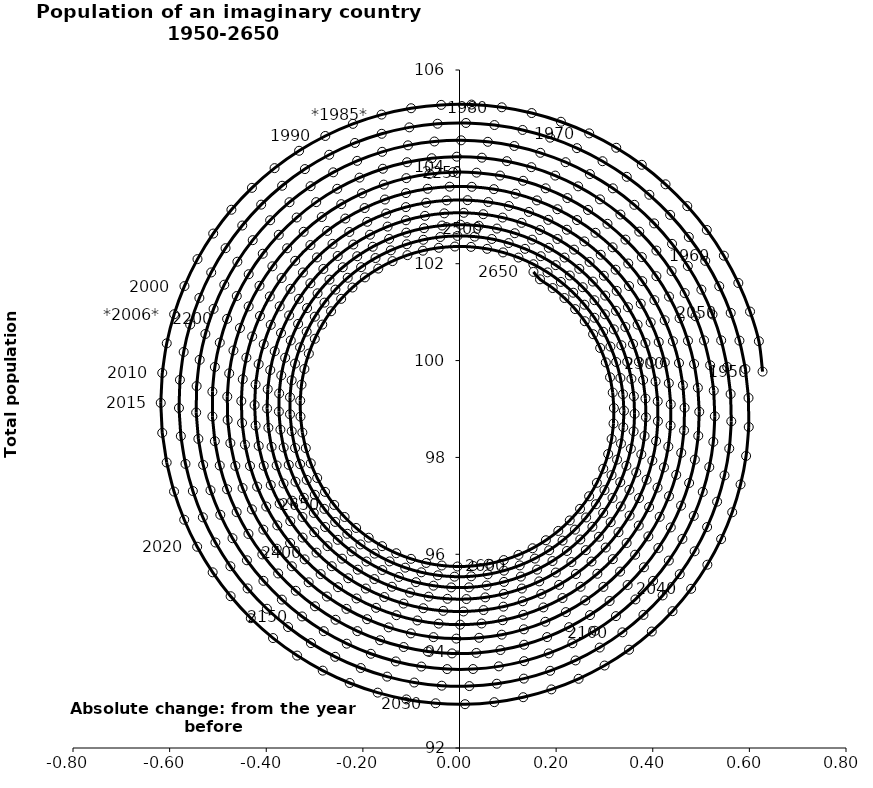
| Category | Series 0 |
|---|---|
| 0.6272672519604754 | 99.772 |
| 0.6196562045831158 | 100.399 |
| 0.6013943906948924 | 101.011 |
| 0.5771655351149434 | 101.602 |
| 0.5472234289554052 | 102.166 |
| 0.511878389816026 | 102.697 |
| 0.4714940510418586 | 103.189 |
| 0.42648362516273153 | 103.64 |
| 0.3773056798647474 | 104.042 |
| 0.3244594696350873 | 104.394 |
| 0.2684798705715252 | 104.691 |
| 0.2099319697122155 | 104.931 |
| 0.1494053635898922 | 105.111 |
| 0.08750822350796739 | 105.23 |
| 0.024861187246976613 | 105.286 |
| -0.03790886147280048 | 105.28 |
| -0.10017506345125327 | 105.21 |
| -0.1613168416955233 | 105.079 |
| -0.22072608389074588 | 104.888 |
| -0.2778131880872081 | 104.638 |
| -0.33201291152538914 | 104.332 |
| -0.38278996460490333 | 103.974 |
| -0.42964429466364606 | 103.567 |
| -0.47211600744074644 | 103.115 |
| -0.5097898778187471 | 102.622 |
| -0.5422994056341395 | 102.095 |
| -0.56933037697938 | 101.538 |
| -0.5906238964330512 | 100.956 |
| -0.605978861002896 | 100.356 |
| -0.6152538522048658 | 99.744 |
| -0.6183684285482727 | 99.126 |
| -0.6153038067254641 | 98.508 |
| -0.6061029259272743 | 97.895 |
| -0.5908698958723164 | 97.295 |
| -0.5697688352941057 | 96.714 |
| -0.5430221136981856 | 96.156 |
| -0.5109080151330829 | 95.628 |
| -0.4737578484511502 | 95.134 |
| -0.4319525340150321 | 94.68 |
| -0.3859187019663963 | 94.27 |
| -0.3361243419849913 | 93.908 |
| -0.28307404886029985 | 93.598 |
| -0.22730391214496848 | 93.342 |
| -0.1693761016173383 | 93.143 |
| -0.1098732032105545 | 93.003 |
| -0.049392362451442295 | 92.924 |
| 0.01146070574339575 | 92.905 |
| 0.07207778084860195 | 92.946 |
| 0.1318542134080971 | 93.049 |
| 0.1901949539233172 | 93.21 |
| 0.2465204738621054 | 93.429 |
| 0.3002725198967795 | 93.703 |
| 0.3509196442617366 | 94.03 |
| 0.3979624564693651 | 94.405 |
| 0.44093854451652703 | 94.826 |
| 0.4794270171128403 | 95.287 |
| 0.5130526223460805 | 95.784 |
| 0.5414894025156158 | 96.313 |
| 0.56446384957367 | 96.867 |
| 0.5817575306752616 | 97.442 |
| 0.593209158683436 | 98.031 |
| 0.5987160880698426 | 98.628 |
| 0.5982352224266663 | 99.228 |
| 0.5917833257051299 | 99.825 |
| 0.5794367352648067 | 100.412 |
| 0.5613304807951423 | 100.984 |
| 0.5376568190890296 | 101.535 |
| 0.5086632004642269 | 102.059 |
| 0.47464968827024734 | 102.552 |
| 0.4359658583291548 | 103.008 |
| 0.3930072103057398 | 103.424 |
| 0.34621112780489227 | 103.794 |
| 0.2960524284253978 | 104.116 |
| 0.24303854901414468 | 104.386 |
| 0.18770441491209766 | 104.602 |
| 0.13060704504295018 | 104.762 |
| 0.07231994722744162 | 104.864 |
| 0.013427360092300944 | 104.906 |
| -0.04548160063804829 | 104.89 |
| -0.10381883284085802 | 104.816 |
| -0.16100311680606438 | 104.683 |
| -0.21646590361674356 | 104.494 |
| -0.26965696547582496 | 104.25 |
| -0.32004985184911305 | 103.954 |
| -0.3671470973470292 | 103.61 |
| -0.4104851298504002 | 103.22 |
| -0.4496388304846519 | 102.789 |
| -0.48422570061708115 | 102.321 |
| -0.5139095950632253 | 101.82 |
| -0.5384039851029385 | 101.293 |
| -0.5574747196720509 | 100.743 |
| -0.5709422581673564 | 100.178 |
| -0.5786833536307228 | 99.602 |
| -0.5806321706106488 | 99.02 |
| -0.5767808276674629 | 98.44 |
| -0.5671793602593951 | 97.867 |
| -0.551935105536522 | 97.306 |
| -0.5312115163388924 | 96.763 |
| -0.5052264173804701 | 96.244 |
| -0.4742497221381896 | 95.753 |
| -0.43860063431895213 | 95.295 |
| -0.3986443628685663 | 94.875 |
| -0.3547883842882058 | 94.498 |
| -0.3074782904756219 | 94.166 |
| -0.2571932643687802 | 93.883 |
| -0.20444122929977482 | 93.651 |
| -0.14975372113445218 | 93.474 |
| -0.0936805349415124 | 93.352 |
| -0.03678420008101568 | 93.287 |
| 0.02036566079016211 | 93.278 |
| 0.07719803225245414 | 93.327 |
| 0.13314620917163467 | 93.433 |
| 0.1876534453238321 | 93.594 |
| 0.2401784913180265 | 93.808 |
| 0.2902009667536447 | 94.074 |
| 0.33722651331639497 | 94.388 |
| 0.380791677807899 | 94.748 |
| 0.420468476902748 | 95.15 |
| 0.4558685987012723 | 95.589 |
| 0.4866471998596964 | 96.062 |
| 0.5125062612019633 | 96.563 |
| 0.5331974691950307 | 97.087 |
| 0.5485245954714983 | 97.629 |
| 0.5583453516501891 | 98.184 |
| 0.5625727019821625 | 98.746 |
| 0.561175621806413 | 99.309 |
| 0.5541792953496412 | 99.868 |
| 0.5416647520138724 | 100.417 |
| 0.5237679459073803 | 100.951 |
| 0.5006782889184791 | 101.465 |
| 0.4726366530678945 | 101.953 |
| 0.4399328631429853 | 102.41 |
| 0.4029027056614538 | 102.833 |
| 0.3619244849892169 | 103.216 |
| 0.3174151618983885 | 103.556 |
| 0.26982611394450373 | 103.851 |
| 0.21963856074321342 | 104.096 |
| 0.1673587004840087 | 104.29 |
| 0.11351260680699227 | 104.431 |
| 0.05864093746635035 | 104.517 |
| 0.003293507976827925 | 104.548 |
| -0.05197621531687702 | 104.524 |
| -0.10661664761269662 | 104.444 |
| -0.1600835881875753 | 104.31 |
| -0.21184563822654923 | 104.124 |
| -0.26138948002991924 | 103.887 |
| -0.3082249651744462 | 103.601 |
| -0.35188996121645744 | 103.27 |
| -0.3919549090376222 | 102.897 |
| -0.4280270459148099 | 102.486 |
| -0.459754252826464 | 102.041 |
| -0.48682848833845327 | 101.567 |
| -0.5089887756163876 | 101.068 |
| -0.5260237136398374 | 100.549 |
| -0.5377734884980043 | 100.016 |
| -0.544131365690653 | 99.473 |
| -0.5450446495718992 | 98.927 |
| -0.5405151014241056 | 98.383 |
| -0.530598813070398 | 97.846 |
| -0.5154055383760792 | 97.322 |
| -0.4950974903932135 | 96.816 |
| -0.46988761722577976 | 96.332 |
| -0.44003737486857375 | 95.876 |
| -0.40585402025537576 | 95.452 |
| -0.36768745250132184 | 95.064 |
| -0.32592663477168315 | 94.716 |
| -0.28099563333637434 | 94.412 |
| -0.23334931411572057 | 94.154 |
| -0.18346874036048888 | 93.946 |
| -0.13185631800843822 | 93.788 |
| -0.07903073768306967 | 93.682 |
| -0.025521764233339184 | 93.629 |
| 0.028135073866664584 | 93.631 |
| 0.08140384204368445 | 93.686 |
| 0.1337535505009484 | 93.794 |
| 0.18466344504081889 | 93.953 |
| 0.2336281851373485 | 94.163 |
| 0.28016285779323624 | 94.42 |
| 0.32380777745829903 | 94.723 |
| 0.36413302451895646 | 95.068 |
| 0.4007426775767087 | 95.452 |
| 0.43327869787729867 | 95.87 |
| 0.461424427807664 | 96.318 |
| 0.48490766930876106 | 96.792 |
| 0.5035033123119277 | 97.288 |
| 0.5170354878589478 | 97.799 |
| 0.5253792253624141 | 98.322 |
| 0.5284615984523953 | 98.85 |
| 0.5262623489920628 | 99.379 |
| 0.5188139840780295 | 99.903 |
| 0.5062013461066073 | 100.417 |
| 0.48856066125316033 | 100.915 |
| 0.4660780769054256 | 101.394 |
| 0.43898770366968165 | 101.847 |
| 0.4075691824894747 | 102.272 |
| 0.372144802108771 | 102.662 |
| 0.3330761965556164 | 103.016 |
| 0.290760656453358 | 103.329 |
| 0.2456270917522545 | 103.597 |
| 0.1981316868826397 | 103.82 |
| 0.1487532923167123 | 103.994 |
| 0.09798859906965163 | 104.117 |
| 0.046347144745759294 | 104.19 |
| -0.00565379868046989 | 104.21 |
| -0.05749440407938522 | 104.178 |
| -0.10865748354022742 | 104.095 |
| -0.15863364602008545 | 103.961 |
| -0.20692636685456023 | 103.778 |
| -0.2530569186985332 | 103.547 |
| -0.2965691149495271 | 103.272 |
| -0.3370338186772628 | 102.954 |
| -0.37405317251572257 | 102.598 |
| -0.4072645078499306 | 102.206 |
| -0.43634389491398906 | 101.783 |
| -0.4610092990791159 | 101.333 |
| -0.481023312608464 | 100.861 |
| -0.496195435458759 | 100.371 |
| -0.5063838832599714 | 99.869 |
| -0.5114969053689506 | 99.358 |
| -0.5114936008208275 | 98.846 |
| -0.5063842250312618 | 98.335 |
| -0.4962299852097303 | 97.833 |
| -0.48114232754625874 | 97.343 |
| -0.46128172430135095 | 96.871 |
| -0.4368559739084503 | 96.42 |
| -0.40811803203080643 | 95.997 |
| -0.3753633961613829 | 95.604 |
| -0.3389270707662675 | 95.246 |
| -0.29918014410745286 | 94.926 |
| -0.2565260116907808 | 94.648 |
| -0.21139628474725214 | 94.413 |
| -0.1642464252205329 | 94.225 |
| -0.11555115138116179 | 94.085 |
| -0.06579966039154073 | 93.994 |
| -0.01549071587704276 | 93.953 |
| 0.034872350186276435 | 93.963 |
| 0.08478667120202488 | 94.023 |
| 0.1337548649810003 | 94.133 |
| 0.18128998799129903 | 94.29 |
| 0.22692037550444155 | 94.495 |
| 0.2701943195469241 | 94.744 |
| 0.31068453828358145 | 95.035 |
| 0.3479923926330102 | 95.366 |
| 0.38175180852584845 | 95.731 |
| 0.41163286624145456 | 96.129 |
| 0.43734502165451516 | 96.555 |
| 0.45863992797212916 | 97.004 |
| 0.47531383059104826 | 97.472 |
| 0.4872095120189428 | 97.954 |
| 0.4942177683459761 | 98.446 |
| 0.4962784034614742 | 98.943 |
| 0.4933807320545682 | 99.439 |
| 0.4855635873598132 | 99.93 |
| 0.4729148345592762 | 100.41 |
| 0.45557039568620183 | 100.875 |
| 0.4337127967415455 | 101.321 |
| 0.40756925247969633 | 101.743 |
| 0.3774093089074597 | 102.136 |
| 0.3435420679152017 | 102.498 |
| 0.3063130225772852 | 102.823 |
| 0.26610053549530477 | 103.11 |
| 0.2233119960516774 | 103.356 |
| 0.17837969557503186 | 103.557 |
| 0.13175646215960768 | 103.712 |
| 0.08391109919389095 | 103.821 |
| 0.03532367352696042 | 103.88 |
| -0.013519299390459594 | 103.891 |
| -0.06212972511934822 | 103.853 |
| -0.1100228058785504 | 103.767 |
| -0.15672187354014966 | 103.633 |
| -0.2017631318124984 | 103.453 |
| -0.2447002604531079 | 103.23 |
| -0.28510883582456614 | 102.964 |
| -0.32259052403085775 | 102.659 |
| -0.35677700523105216 | 102.319 |
| -0.38733359049046356 | 101.946 |
| -0.4139624956793 | 101.544 |
| -0.43640574042136393 | 101.118 |
| -0.45444764390167336 | 100.671 |
| -0.46791689342487075 | 100.209 |
| -0.4766881659279889 | 99.736 |
| -0.4806832871534539 | 99.256 |
| -0.47987191783379757 | 98.774 |
| -0.4742717609854594 | 98.296 |
| -0.4639482891959048 | 97.826 |
| -0.44901399558829524 | 97.368 |
| -0.4296271768914437 | 96.928 |
| -0.4059902616976174 | 96.509 |
| -0.37834770150801944 | 96.116 |
| -0.34698344648828794 | 95.752 |
| -0.31221803196628173 | 95.422 |
| -0.27440530553314346 | 95.128 |
| -0.23392882813690363 | 94.873 |
| -0.19119798574843117 | 94.66 |
| -0.14664385099336386 | 94.49 |
| -0.1007148365610746 | 94.366 |
| -0.05387218419794948 | 94.289 |
| -0.006585334645613727 | 94.259 |
| 0.040672775018386176 | 94.276 |
| 0.08743043954664387 | 94.34 |
| 0.13322189194391854 | 94.451 |
| 0.17759194120627342 | 94.607 |
| 0.22010049521727382 | 94.806 |
| 0.26032692387967415 | 95.047 |
| 0.29787421924691415 | 95.327 |
| 0.33237291152997983 | 95.642 |
| 0.36348470237535935 | 95.991 |
| 0.390905779709378 | 96.369 |
| 0.414369781693793 | 96.773 |
| 0.433650380905398 | 97.198 |
| 0.44856346370246314 | 97.64 |
| 0.4589688838288879 | 98.095 |
| 0.4647717736025214 | 98.558 |
| 0.4659234004835824 | 99.025 |
| 0.4624215613767859 | 99.49 |
| 0.4543105116585906 | 99.95 |
| 0.4416804305662936 | 100.399 |
| 0.4246664292107951 | 100.833 |
| 0.40344711203183437 | 101.248 |
| 0.37824270694668627 | 101.64 |
| 0.34931278372143737 | 102.005 |
| 0.3169535841635778 | 102.339 |
| 0.28149499156326385 | 102.639 |
| 0.24329717035773513 | 102.902 |
| 0.20274691022287072 | 103.125 |
| 0.16025371167737745 | 103.307 |
| 0.11624565279311838 | 103.446 |
| 0.0711650787103082 | 103.54 |
| 0.025464157340742588 | 103.588 |
| -0.020399654106292076 | 103.59 |
| -0.06596818634178447 | 103.547 |
| -0.11078713317798616 | 103.459 |
| -0.1544105790040362 | 103.326 |
| -0.19640543345522588 | 103.15 |
| -0.23635572919128833 | 102.933 |
| -0.27386674015434664 | 102.677 |
| -0.3085688795534338 | 102.385 |
| -0.34012133910318454 | 102.06 |
| -0.368215433705565 | 101.705 |
| -0.3925776187722576 | 101.323 |
| -0.41297215072280125 | 100.92 |
| -0.4292033648111442 | 100.498 |
| -0.4411175483067922 | 100.061 |
| -0.4486043911404849 | 99.615 |
| -0.4515980003750997 | 99.164 |
| -0.450077469249031 | 98.712 |
| -0.44406699599922206 | 98.264 |
| -0.43363555217774774 | 97.824 |
| -0.4188961046735855 | 97.397 |
| -0.40000440009789173 | 96.986 |
| -0.37715732454069695 | 96.597 |
| -0.3505908559229667 | 96.232 |
| -0.3205776301991534 | 95.895 |
| -0.2874241464756295 | 95.591 |
| -0.25146763966972685 | 95.321 |
| -0.21307265259030572 | 95.088 |
| -0.17262734226162024 | 94.894 |
| -0.13053955789442995 | 94.742 |
| -0.08723273011175081 | 94.633 |
| -0.04314161284411 | 94.568 |
| 0.0012920793045125833 | 94.547 |
| 0.04562409446047866 | 94.571 |
| 0.08941208337507334 | 94.638 |
| 0.13222001145481954 | 94.749 |
| 0.17362249893928805 | 94.903 |
| 0.2132090460437368 | 95.097 |
| 0.25058810111738694 | 95.329 |
| 0.28539093152042483 | 95.598 |
| 0.3172752589728205 | 95.9 |
| 0.345928623552922 | 96.232 |
| 0.3710714433085158 | 96.592 |
| 0.39245973954456304 | 96.975 |
| 0.4098875012491163 | 97.377 |
| 0.42318866577645053 | 97.794 |
| 0.4322386967804732 | 98.223 |
| 0.4369557444521135 | 98.659 |
| 0.4373013773121528 | 99.097 |
| 0.43328087911037727 | 99.533 |
| 0.42494310873639307 | 99.964 |
| 0.4123799254142213 | 100.383 |
| 0.39572518578569316 | 100.788 |
| 0.375153323751249 | 101.175 |
| 0.3508775280789749 | 101.539 |
| 0.32314753677592023 | 101.877 |
| 0.29224707100832603 | 102.185 |
| 0.25849093490469954 | 102.461 |
| 0.22222181086251425 | 102.702 |
| 0.18380678295850572 | 102.905 |
| 0.14363362371015853 | 103.07 |
| 0.10210688173065563 | 103.193 |
| 0.05964380973017569 | 103.274 |
| 0.016670173832103785 | 103.312 |
| -0.026384013724552347 | 103.307 |
| -0.06908879574430671 | 103.259 |
| -0.1110185620909192 | 103.169 |
| -0.15175628973267408 | 103.037 |
| -0.19089768859343792 | 102.865 |
| -0.22805521201135548 | 102.655 |
| -0.26286189204071064 | 102.409 |
| -0.2949749616594346 | 102.13 |
| -0.32407922815006884 | 101.819 |
| -0.3498901644748571 | 101.482 |
| -0.3721566883483902 | 101.12 |
| -0.3906636018893579 | 100.737 |
| -0.40523366817595985 | 100.338 |
| -0.4157293046991768 | 99.927 |
| -0.4220538775755571 | 99.507 |
| -0.4241525843976959 | 99.083 |
| -0.4220129177290417 | 98.658 |
| -0.4156647054570968 | 98.239 |
| -0.40517972844449446 | 97.827 |
| -0.39067092014141025 | 97.428 |
| -0.3722911569844314 | 97.046 |
| -0.3502316524730986 | 96.684 |
| -0.32471997174896927 | 96.345 |
| -0.29601768725478195 | 96.034 |
| -0.26441769959338757 | 95.753 |
| -0.23024125100025117 | 95.505 |
| -0.19383466185807663 | 95.293 |
| -0.15556582338430047 | 95.118 |
| -0.11582048199178985 | 94.982 |
| -0.07499835283029199 | 94.886 |
| -0.033509101647702266 | 94.832 |
| 0.008231764653849893 | 94.819 |
| 0.04980705756195647 | 94.848 |
| 0.09080207497391513 | 94.919 |
| 0.1308087360680048 | 95.03 |
| 0.169429641815114 | 95.18 |
| 0.2062820207445455 | 95.369 |
| 0.24100152080398374 | 95.593 |
| 0.27324580976791424 | 95.851 |
| 0.3026979486357959 | 96.139 |
| 0.32906950479760866 | 96.456 |
| 0.35210337440859973 | 96.797 |
| 0.37157628638087203 | 97.16 |
| 0.38730096362917266 | 97.541 |
| 0.39912792068243874 | 97.935 |
| 0.40694688044246163 | 98.339 |
| 0.4106877967058935 | 98.749 |
| 0.4103214730326812 | 99.16 |
| 0.4058597725863322 | 99.569 |
| 0.39735541767063154 | 99.972 |
| 0.38490138178355693 | 100.364 |
| 0.36862988106992844 | 100.742 |
| 0.34871097604295187 | 101.101 |
| 0.3253507983115256 | 101.439 |
| 0.2987894207635122 | 101.752 |
| 0.26929839317956805 | 102.037 |
| 0.23717796854803197 | 102.291 |
| 0.20275404838503874 | 102.511 |
| 0.16637487811792084 | 102.696 |
| 0.12840752601886862 | 102.844 |
| 0.08923418127083949 | 102.953 |
| 0.049248308483278436 | 103.022 |
| 0.008850697331567403 | 103.051 |
| -0.0315545530341268 | 103.04 |
| -0.07156407459442704 | 102.988 |
| -0.11077925569455971 | 102.897 |
| -0.14881021075431988 | 102.767 |
| -0.18527965493724707 | 102.599 |
| -0.2198266452885207 | 102.396 |
| -0.25211015126272684 | 102.16 |
| -0.2818124193381806 | 101.892 |
| -0.3086420985414122 | 101.596 |
| -0.3323370961595984 | 101.275 |
| -0.35266713566991115 | 100.931 |
| -0.3694359919482366 | 100.569 |
| -0.38248338208768473 | 100.192 |
| -0.3916864936388933 | 99.804 |
| -0.3969611357415914 | 99.409 |
| -0.3982625024094091 | 99.011 |
| -0.3955855411227702 | 98.613 |
| -0.3889649238387918 | 98.219 |
| -0.37847462150294575 | 97.835 |
| -0.3642270871008364 | 97.462 |
| -0.3463720561892245 | 97.106 |
| -0.32509497764257134 | 96.77 |
| -0.3006150910204255 | 96.456 |
| -0.27318317045577345 | 96.168 |
| -0.2430789582496331 | 95.91 |
| -0.21060831441451455 | 95.682 |
| -0.17610011118834024 | 95.488 |
| -0.13990290402865924 | 95.33 |
| -0.10238141276761326 | 95.209 |
| -0.06391284843338241 | 95.125 |
| -0.024883122715060324 | 95.081 |
| 0.014317021854765244 | 95.076 |
| 0.053295922210431 | 95.109 |
| 0.09166490644019376 | 95.182 |
| 0.1290421677979552 | 95.293 |
| 0.16505656244176947 | 95.44 |
| 0.19935129314028188 | 95.623 |
| 0.23158744240149787 | 95.839 |
| 0.26144732005423776 | 96.086 |
| 0.28863759223607843 | 96.362 |
| 0.312892160987964 | 96.663 |
| 0.3339747662079233 | 96.988 |
| 0.35168128454453296 | 97.331 |
| 0.3658417028861578 | 97.691 |
| 0.37632174739511726 | 98.063 |
| 0.3830241525141389 | 98.444 |
| 0.3858895579944317 | 98.829 |
| 0.3848970257349933 | 99.215 |
| 0.38006417203459364 | 99.599 |
| 0.3714469147010675 | 99.975 |
| 0.35913883831543103 | 100.342 |
| 0.34327018474898807 | 100.694 |
| 0.3240064797583031 | 101.028 |
| 0.30154681009729245 | 101.342 |
| 0.2761217690424189 | 101.631 |
| 0.24799109150350063 | 101.894 |
| 0.21744100294774427 | 102.127 |
| 0.1847813091736512 | 102.329 |
| 0.15034225650479982 | 102.497 |
| 0.1144711942059331 | 102.63 |
| 0.077529072833876 | 102.726 |
| 0.03988681380753434 | 102.785 |
| 0.0019215866958859351 | 102.806 |
| -0.03598696842986726 | 102.789 |
| -0.0734605357583007 | 102.734 |
| -0.1101258976981967 | 102.642 |
| -0.14561865040478494 | 102.513 |
| -0.1795868238975018 | 102.35 |
| -0.2116943708214336 | 102.154 |
| -0.24162448928755254 | 101.927 |
| -0.26908274695282586 | 101.671 |
| -0.29379997555033555 | 101.389 |
| -0.3155349074323439 | 101.083 |
| -0.33407652832354984 | 100.758 |
| -0.3492461233626756 | 100.415 |
| -0.3608989966220193 | 100.059 |
| -0.3689258475910364 | 99.693 |
| -0.37325379156795435 | 99.321 |
| -0.3738470144867634 | 98.947 |
| -0.370707056369433 | 98.574 |
| -0.36387272131914017 | 98.205 |
| -0.3534196156980016 | 97.846 |
| -0.3394593198413389 | 97.499 |
| -0.3221382023107324 | 97.167 |
| -0.3016358892366853 | 96.854 |
| -0.27816340471908774 | 96.564 |
| -0.2519610015075955 | 96.298 |
| -0.22329570423639922 | 96.06 |
| -0.1924585903114533 | 95.851 |
| -0.15976183612040984 | 95.675 |
| -0.12553555851899034 | 95.532 |
| -0.09012448353435332 | 95.424 |
| -0.05388447588601508 | 95.352 |
| -0.01717896424617038 | 95.316 |
| 0.019624701865701866 | 95.317 |
| 0.05615892705007752 | 95.355 |
| 0.09205954010660378 | 95.43 |
| 0.12696942259769628 | 95.539 |
| 0.16054205975685676 | 95.684 |
| 0.19244497844903918 | 95.861 |
| 0.22236303808924873 | 96.068 |
| 0.25000154196000324 | 96.305 |
| 0.275089138227834 | 96.568 |
| 0.29738048211985557 | 96.855 |
| 0.31665863315972587 | 97.163 |
| 0.33273716406372245 | 97.489 |
| 0.3454619608199252 | 97.829 |
| 0.3547126965970051 | 98.18 |
| 0.3604039654220941 | 98.538 |
| 0.3624860649892412 | 98.9 |
| 0.36094542148604347 | 99.263 |
| 0.35580465291190677 | 99.622 |
| 0.34712227097823956 | 99.975 |
| 0.33499202528895466 | 100.317 |
| 0.31954189706307545 | 100.645 |
| 0.30093275314369805 | 100.956 |
| 0.27935667441000334 | 101.247 |
| 0.2550349759296964 | 101.514 |
| 0.22821593923055872 | 101.757 |
| 0.19917227990651298 | 101.971 |
| 0.1681983763649697 | 102.155 |
| 0.13560728785855503 | 102.307 |
| 0.10172759199016923 | 102.426 |
| 0.0669000736212908 | 102.511 |
| 0.031474298535208334 | 102.56 |
| -0.004194893711229497 | 102.574 |
| -0.03975094257505418 | 102.552 |
| -0.07483912939608217 | 102.494 |
| -0.10911011476044763 | 102.402 |
| -0.1422234150969146 | 102.276 |
| -0.17385078392214837 | 102.117 |
| -0.2036794641710955 | 101.928 |
| -0.2314152794033575 | 101.71 |
| -0.25678553334905985 | 101.465 |
| -0.2795416892311664 | 101.197 |
| -0.29946180255861066 | 100.906 |
| -0.3163526835961221 | 100.598 |
| -0.330051768463683 | 100.274 |
| -0.3404286807693637 | 99.938 |
| -0.34738646880523305 | 99.593 |
| -0.35086250660234697 | 99.243 |
| -0.35082905052303914 | 98.891 |
| -0.3472934465223432 | 98.541 |
| -0.3402979867058704 | 98.196 |
| -0.3299194173194806 | 97.86 |
| -0.3162681037760038 | 97.537 |
| -0.2994868617413218 | 97.228 |
| -0.27974946661579736 | 96.938 |
| -0.25725885693172756 | 96.668 |
| -0.23224505021467223 | 96.423 |
| -0.20496279268796513 | 96.204 |
| -0.17568896681424206 | 96.013 |
| -0.1447197830375515 | 95.853 |
| -0.11236778419155513 | 95.724 |
| -0.0789586928516357 | 95.628 |
| -0.044828133417091465 | 95.566 |
| -0.010318261895584158 | 95.538 |
| 0.024225662781560686 | 95.545 |
| 0.05845873156897596 | 95.587 |
| 0.09203982772545771 | 95.662 |
| 0.12463502449673314 | 95.771 |
| 0.15592090423459837 | 95.911 |
| 0.18558776597489413 | 96.083 |
| 0.2133426896779227 | 96.283 |
| 0.2389124268275964 | 96.509 |
| 0.26204608888050274 | 96.76 |
| 0.2825176071317017 | 97.033 |
| 0.3001279398959369 | 97.325 |
| 0.31470700547779984 | 97.634 |
| 0.3261153221809465 | 97.955 |
| 0.3342453395707281 | 98.286 |
| 0.3390224483172233 | 98.623 |
| 0.34040565917969445 | 98.964 |
| 0.33838794501707525 | 99.304 |
| 0.33299624308038744 | 99.641 |
| 0.32429111824632173 | 99.97 |
| 0.3123660912292294 | 100.289 |
| 0.2973466391477544 | 100.595 |
| 0.2793888790778709 | 100.884 |
| 0.25867794836666747 | 101.154 |
| 0.23542609848343687 | 101.401 |
| 0.20987052200599265 | 101.624 |
| 0.1822709349703402 | 101.821 |
| 0.1529069392068365 | 101.989 |
| 0.12207519143160539 | 102.127 |
| 0.09008640774150933 | 102.233 |
| 0.057262233743664126 | 102.307 |
| 0.023932011832322075 | 102.348 |
| -0.009570521909438412 | 102.355 |
| -0.04291057806955223 | 102.329 |
| -0.07575565810758889 | 102.269 |
| -0.10777886900486067 | 102.177 |
| -0.13866217533334435 | 102.053 |
| -0.1680995564048473 | 101.9 |
| -0.19580003717258876 | 101.717 |
| -0.22149056288134972 | 101.508 |
| -0.24491868908143033 | 101.274 |
| -0.2658550605215595 | 101.018 |
| -0.28409565459779174 | 100.743 |
| -0.2994637674308649 | 100.45 |
| -0.31181172326233764 | 100.144 |
| -0.32102229065635157 | 99.826 |
| -0.32700979195597313 | 99.502 |
| -0.3297208955315867 | 99.172 |
| -0.3291350835456939 | 98.842 |
| -0.3252647912148845 | 98.514 |
| -0.31815521683195414 | 98.192 |
| -0.30788380510516333 | 97.878 |
| -0.29455940962426297 | 97.576 |
| -0.278321143455031 | 97.289 |
| -0.25933692995863566 | 97.019 |
| -0.23780176890314664 | 96.77 |
| -0.213935735745018 | 96.544 |
| -0.18798173458383616 | 96.342 |
| -0.16020302771688222 | 96.168 |
| -0.1308805668991866 | 96.022 |
| -0.10031015334804749 | 95.906 |
| -0.06879945518481634 | 95.821 |
| -0.03666491237151348 | 95.768 |
| -0.004228560265296721 | 95.748 |
| 0.028185196337680907 | 95.76 |
| 0.060252826366131274 | 95.804 |
| 0.09165490043569946 | 95.88 |
| 0.12207927141581365 | 95.988 |
| 0.15122417594498216 | 96.125 |
| 0.1788012260917995 | 96.29 |
| 0.20453826151562993 | 96.482 |
| 0.22818203393405412 | 96.699 |
| 0.24950069743351122 | 96.938 |
| 0.2682860801511424 | 97.198 |
| 0.2843557150877132 | 97.475 |
| 0.29755461025926166 | 97.767 |
| 0.30775674103764317 | 98.07 |
| 0.314866250337019 | 98.382 |
| 0.3188183452502571 | 98.7 |
| 0.31957988178967156 | 99.02 |
| 0.3171496325183014 | 99.339 |
| 0.31155823503372204 | 99.654 |
| 0.30286782245583765 | 99.962 |
| 0.29117134024404123 | 100.26 |
| 0.27659155678923497 | 100.545 |
| 0.2592797782697218 | 100.813 |
| 0.23941428119123742 | 101.063 |
| 0.2171984788222332 | 101.292 |
| 0.1928588403610405 | 101.497 |
| 0.16664258410018107 | 101.678 |
| 0.15309742518009273 | 101.831 |